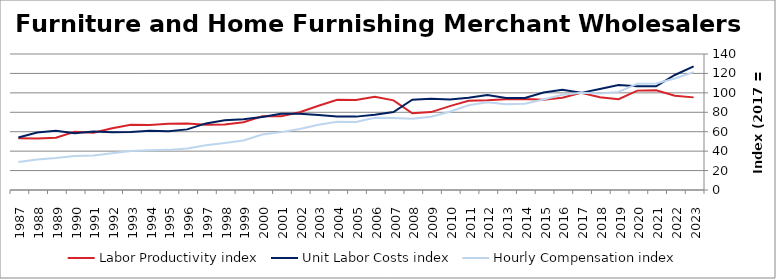
| Category | Labor Productivity index | Unit Labor Costs index | Hourly Compensation index |
|---|---|---|---|
| 2023.0 | 95.348 | 127.303 | 121.381 |
| 2022.0 | 96.957 | 118.374 | 114.771 |
| 2021.0 | 102.587 | 106.817 | 109.581 |
| 2020.0 | 102.299 | 106.883 | 109.341 |
| 2019.0 | 93.549 | 107.965 | 101 |
| 2018.0 | 95.487 | 104.063 | 99.366 |
| 2017.0 | 100 | 100 | 100 |
| 2016.0 | 95.032 | 103.249 | 98.12 |
| 2015.0 | 92.893 | 100.358 | 93.225 |
| 2014.0 | 93.712 | 94.643 | 88.692 |
| 2013.0 | 93.359 | 94.683 | 88.395 |
| 2012.0 | 92.37 | 97.671 | 90.218 |
| 2011.0 | 91.826 | 94.902 | 87.145 |
| 2010.0 | 86.343 | 93.222 | 80.491 |
| 2009.0 | 80.208 | 93.928 | 75.338 |
| 2008.0 | 78.959 | 92.885 | 73.341 |
| 2007.0 | 92.249 | 80.292 | 74.068 |
| 2006.0 | 95.979 | 77.379 | 74.268 |
| 2005.0 | 92.599 | 75.536 | 69.946 |
| 2004.0 | 92.909 | 75.737 | 70.366 |
| 2003.0 | 86.769 | 77.289 | 67.063 |
| 2002.0 | 79.999 | 78.594 | 62.874 |
| 2001.0 | 75.818 | 78.575 | 59.575 |
| 2000.0 | 75.927 | 75.199 | 57.096 |
| 1999.0 | 69.795 | 72.922 | 50.896 |
| 1998.0 | 67.507 | 71.691 | 48.397 |
| 1997.0 | 67.218 | 68.547 | 46.076 |
| 1996.0 | 68.43 | 62.406 | 42.705 |
| 1995.0 | 68.273 | 60.502 | 41.307 |
| 1994.0 | 67.038 | 60.984 | 40.883 |
| 1993.0 | 67.248 | 59.703 | 40.15 |
| 1992.0 | 63.659 | 59.465 | 37.855 |
| 1991.0 | 58.967 | 60.202 | 35.499 |
| 1990.0 | 60.02 | 58.422 | 35.065 |
| 1989.0 | 53.788 | 61.047 | 32.836 |
| 1988.0 | 52.982 | 59.178 | 31.354 |
| 1987.0 | 53.327 | 54.101 | 28.85 |